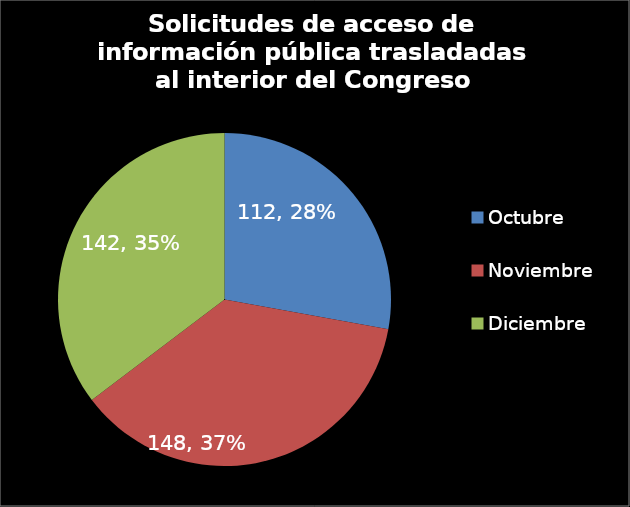
| Category | Series 0 |
|---|---|
| Octubre | 112 |
| Noviembre | 148 |
| Diciembre | 142 |